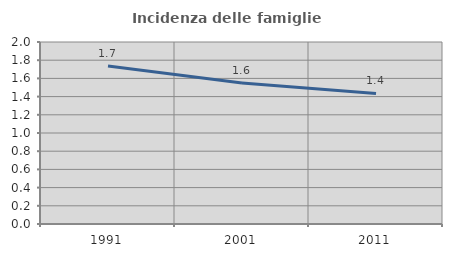
| Category | Incidenza delle famiglie numerose |
|---|---|
| 1991.0 | 1.737 |
| 2001.0 | 1.551 |
| 2011.0 | 1.435 |